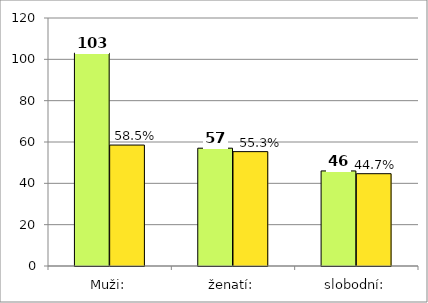
| Category | Series 0 | Series 1 |
|---|---|---|
| Muži: | 103 | 58.523 |
| ženatí: | 57 | 55.34 |
| slobodní: | 46 | 44.66 |